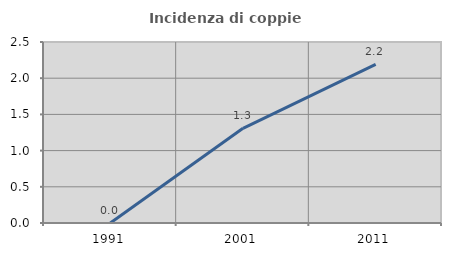
| Category | Incidenza di coppie miste |
|---|---|
| 1991.0 | 0 |
| 2001.0 | 1.308 |
| 2011.0 | 2.192 |